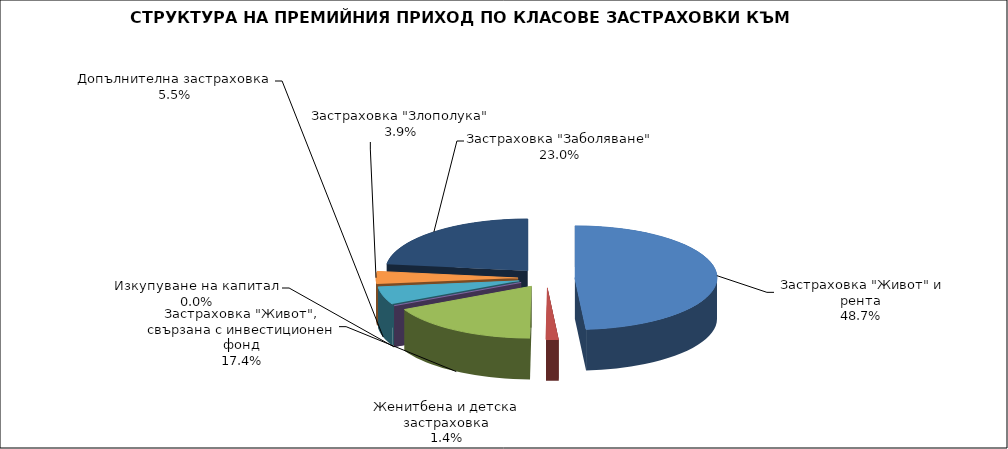
| Category |  Застраховка "Живот" и рента |
|---|---|
|  Застраховка "Живот" и рента | 129480227.475 |
| Женитбена и детска застраховка | 3763630.241 |
| Застраховка "Живот", свързана с инвестиционен фонд | 46283585.74 |
| Изкупуване на капитал | 0 |
| Допълнителна застраховка | 14707506.434 |
| Застраховка "Злополука" | 10388413.971 |
| Застраховка "Заболяване" | 60993223.94 |